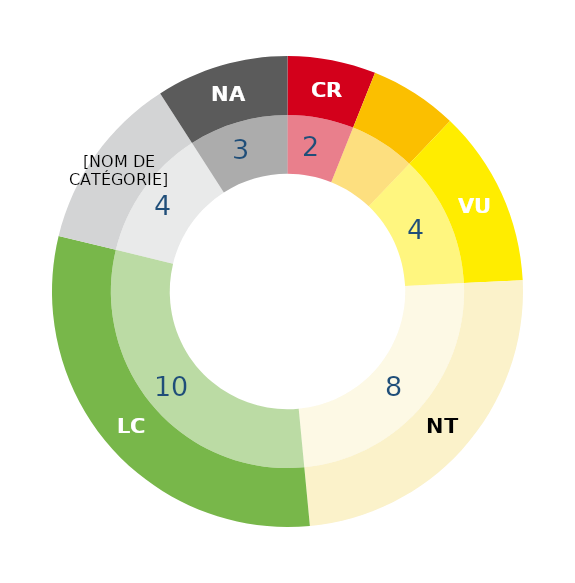
| Category | Series 1 | Series 0 |
|---|---|---|
| RE | 0 | 0 |
| CR | 2 | 2 |
| EN | 2 | 2 |
| VU | 4 | 4 |
| NT | 8 | 8 |
| LC | 10 | 10 |
| DD | 4 | 4 |
| NA | 3 | 3 |